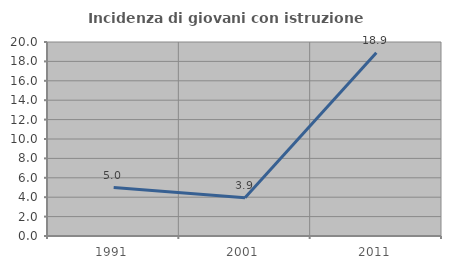
| Category | Incidenza di giovani con istruzione universitaria |
|---|---|
| 1991.0 | 5 |
| 2001.0 | 3.937 |
| 2011.0 | 18.902 |